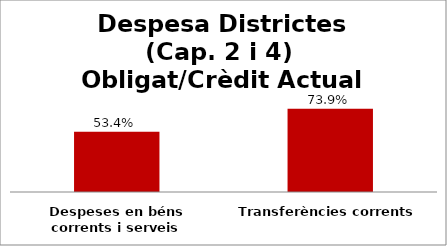
| Category | Series 0 |
|---|---|
| Despeses en béns corrents i serveis | 0.534 |
| Transferències corrents | 0.739 |